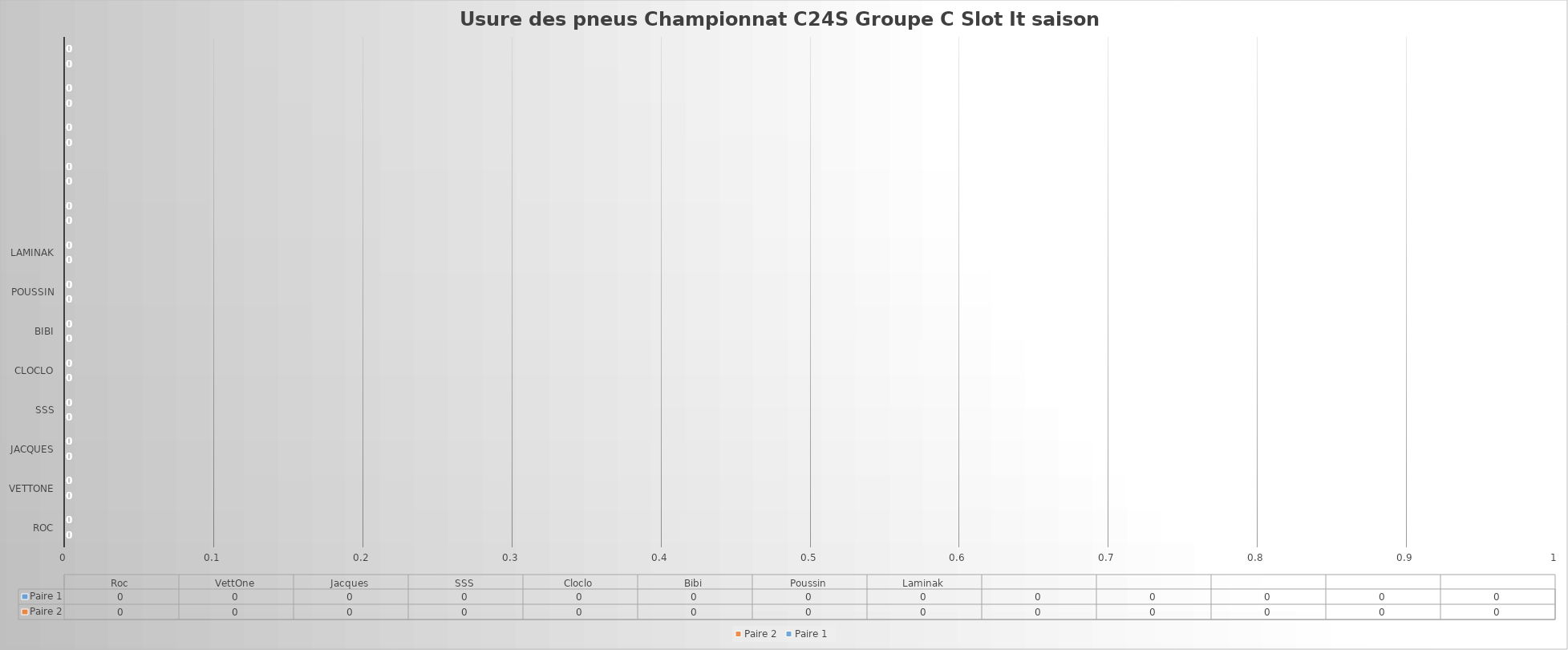
| Category | Paire 2 | Paire 1 |
|---|---|---|
| Roc | 0 | 0 |
| VettOne | 0 | 0 |
| Jacques | 0 | 0 |
| SSS | 0 | 0 |
| Cloclo | 0 | 0 |
| Bibi | 0 | 0 |
| Poussin | 0 | 0 |
| Laminak | 0 | 0 |